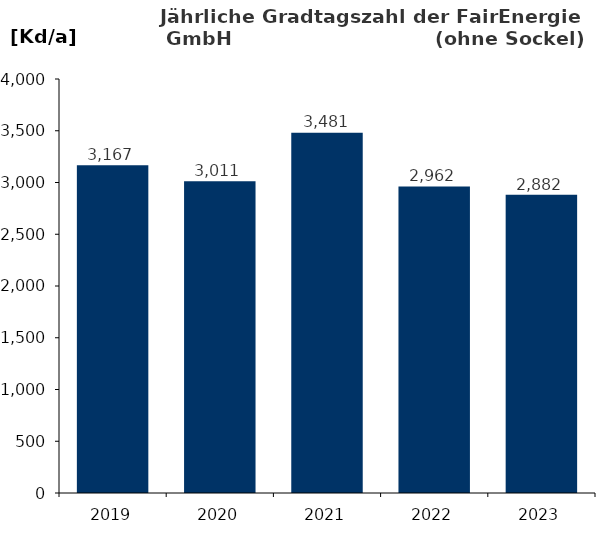
| Category | Gradtagszahl |
|---|---|
| 2019.0 | 3166.7 |
| 2020.0 | 3011 |
| 2021.0 | 3480.7 |
| 2022.0 | 2961.8 |
| 2023.0 | 2882 |